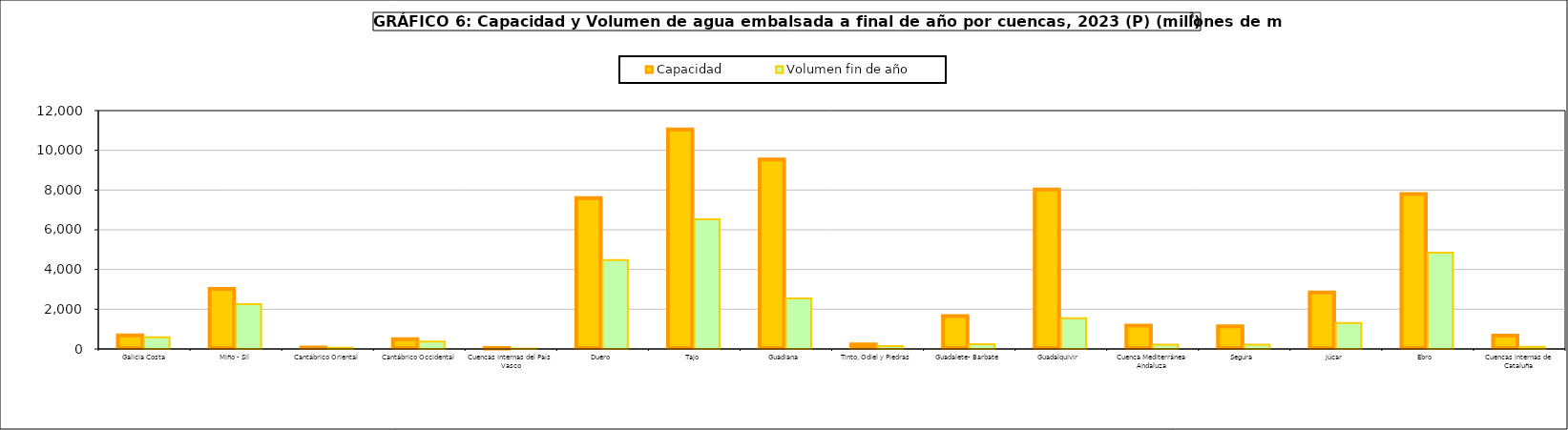
| Category | Capacidad | Volumen fin de año |
|---|---|---|
| Galicia Costa | 684 | 585 |
| Miño - Sil | 3030 | 2261 |
| Cantábrico Oriental | 73 | 62 |
| Cantábrico Occidental | 490 | 369 |
| Cuencas Internas del País Vasco | 21 | 17 |
| Duero  | 7600 | 4476 |
| Tajo  | 11056 | 6526 |
| Guadiana  | 9538 | 2542 |
| Tinto, Odiel y Piedras | 229 | 139 |
| Guadalete- Barbate | 1651 | 239 |
| Guadalquivir  | 8028 | 1547 |
| Cuenca Mediterránea Andaluza | 1174 | 221 |
| Segura  | 1140 | 216 |
| Júcar  | 2846 | 1310 |
| Ebro  | 7802 | 4850 |
| Cuencas internas de Cataluña | 677 | 114 |